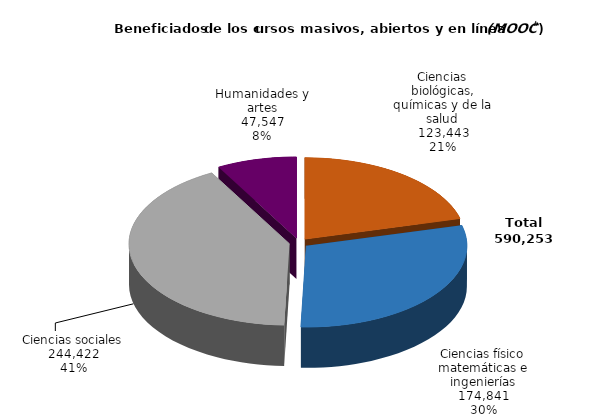
| Category | Series 0 |
|---|---|
| Ciencias biológicas, químicas y de la salud | 123443 |
| Ciencias físico matemáticas e ingenierías | 174841 |
| Ciencias sociales | 244422 |
| Humanidades y artes | 47547 |